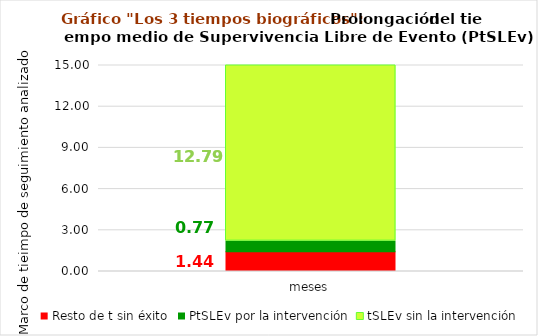
| Category | Resto de t sin éxito | PtSLEv por la intervención | tSLEv sin la intervención |
|---|---|---|---|
| meses | 1.445 | 0.768 | 12.788 |